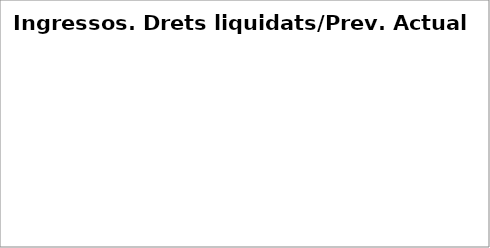
| Category | Series 0 |
|---|---|
| Impostos directes | 0.98 |
| Impostos indirectes | 1.002 |
| Taxes, preus públics i altres ingressos | 1.245 |
| Transferències corrents | 0.996 |
| Ingressos patrimonials | 0.629 |
| Venda d'inversions reals | 43.817 |
| Transferències de capital | 0.798 |
| Actius financers* | 0 |
| Passius financers | 0.388 |